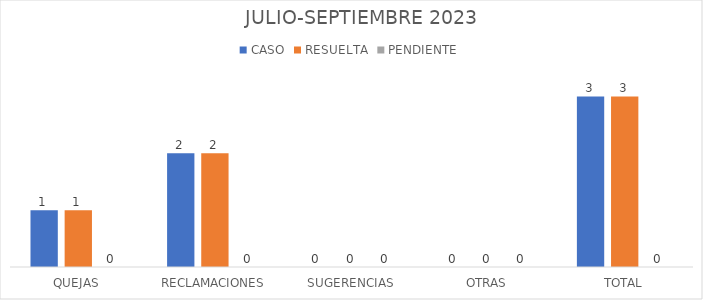
| Category | CASO | RESUELTA | PENDIENTE |
|---|---|---|---|
| QUEJAS | 1 | 1 | 0 |
| RECLAMACIONES | 2 | 2 | 0 |
| SUGERENCIAS | 0 | 0 | 0 |
| OTRAS | 0 | 0 | 0 |
| TOTAL | 3 | 3 | 0 |